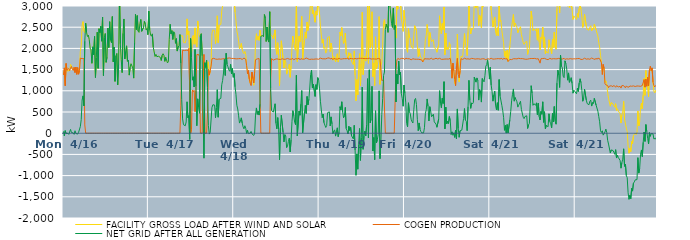
| Category | FACILITY GROSS LOAD AFTER WIND AND SOLAR | COGEN PRODUCTION | NET GRID AFTER ALL GENERATION |
|---|---|---|---|
|  Mon  4/16 | 1417 | 1374 | 43 |
|  Mon  4/16 | 1478 | 1541 | -63 |
|  Mon  4/16 | 1179 | 1119 | 60 |
|  Mon  4/16 | 1636 | 1644 | -8 |
|  Mon  4/16 | 1482 | 1484 | -2 |
|  Mon  4/16 | 1458 | 1461 | -3 |
|  Mon  4/16 | 1496 | 1524 | -28 |
|  Mon  4/16 | 1467 | 1479 | -12 |
|  Mon  4/16 | 1623 | 1533 | 90 |
|  Mon  4/16 | 1590 | 1574 | 16 |
|  Mon  4/16 | 1522 | 1511 | 11 |
|  Mon  4/16 | 1487 | 1480 | 7 |
|  Mon  4/16 | 1528 | 1555 | -27 |
|  Mon  4/16 | 1488 | 1430 | 58 |
|  Mon  4/16 | 1553 | 1560 | -7 |
|  Mon  4/16 | 1400 | 1387 | 13 |
|  Mon  4/16 | 1527 | 1548 | -21 |
|  Mon  4/16 | 1409 | 1391 | 18 |
|  Mon  4/16 | 1481 | 1472 | 9 |
|  Mon  4/16 | 1926 | 1770 | 156 |
|  Mon  4/16 | 2071 | 1752 | 319 |
|  Mon  4/16 | 2542 | 1759 | 783 |
|  Mon  4/16 | 2632 | 1752 | 880 |
|  Mon  4/16 | 2407 | 1762 | 645 |
|  Mon  4/16 | 2365 | 195 | 2170 |
|  Mon  4/16 | 2596 | 0 | 2596 |
|  Mon  4/16 | 2373 | 0 | 2373 |
|  Mon  4/16 | 2281 | 0 | 2281 |
|  Mon  4/16 | 2313 | 0 | 2313 |
|  Mon  4/16 | 2209 | 0 | 2209 |
|  Mon  4/16 | 2005 | 0 | 2005 |
|  Mon  4/16 | 1966 | 0 | 1966 |
|  Mon  4/16 | 1649 | 0 | 1649 |
|  Mon  4/16 | 2037 | 0 | 2037 |
|  Mon  4/16 | 1851 | 0 | 1851 |
|  Mon  4/16 | 2282 | 0 | 2282 |
|  Mon  4/16 | 1314 | 0 | 1314 |
|  Mon  4/16 | 1778 | 0 | 1778 |
|  Mon  4/16 | 2382 | 0 | 2382 |
|  Mon  4/16 | 1529 | 0 | 1529 |
|  Mon  4/16 | 2464 | 0 | 2464 |
|  Mon  4/16 | 2372 | 0 | 2372 |
|  Mon  4/16 | 2521 | 0 | 2521 |
|  Mon  4/16 | 2170 | 0 | 2170 |
|  Mon  4/16 | 2740 | 0 | 2740 |
|  Mon  4/16 | 1359 | 0 | 1359 |
|  Mon  4/16 | 2252 | 0 | 2252 |
|  Mon  4/16 | 2350 | 0 | 2350 |
|  Mon  4/16 | 1672 | 0 | 1672 |
|  Mon  4/16 | 1791 | 0 | 1791 |
|  Mon  4/16 | 2481 | 0 | 2481 |
|  Mon  4/16 | 2020 | 0 | 2020 |
|  Mon  4/16 | 2630 | 0 | 2630 |
|  Mon  4/16 | 2192 | 0 | 2192 |
|  Mon  4/16 | 2135 | 0 | 2135 |
|  Mon  4/16 | 2751 | 0 | 2751 |
|  Mon  4/16 | 1683 | 0 | 1683 |
|  Mon  4/16 | 2033 | 0 | 2033 |
|  Mon  4/16 | 1223 | 0 | 1223 |
|  Mon  4/16 | 1823 | 0 | 1823 |
|  Mon  4/16 | 1880 | 0 | 1880 |
|  Mon  4/16 | 1140 | 0 | 1140 |
|  Mon  4/16 | 1627 | 0 | 1627 |
|  Mon  4/16 | 3391 | 0 | 3391 |
|  Mon  4/16 | 2108 | 0 | 2108 |
|  Mon  4/16 | 1739 | 0 | 1739 |
|  Mon  4/16 | 1429 | 0 | 1429 |
|  Mon  4/16 | 2355 | 0 | 2355 |
|  Mon  4/16 | 2694 | 0 | 2694 |
|  Mon  4/16 | 1751 | 0 | 1751 |
|  Mon  4/16 | 1930 | 0 | 1930 |
|  Mon  4/16 | 2061 | 0 | 2061 |
|  Mon  4/16 | 1694 | 0 | 1694 |
|  Mon  4/16 | 1724 | 0 | 1724 |
|  Mon  4/16 | 1370 | 0 | 1370 |
|  Mon  4/16 | 1555 | 0 | 1555 |
|  Mon  4/16 | 1638 | 0 | 1638 |
|  Mon  4/16 | 1657 | 0 | 1657 |
|  Mon  4/16 | 1538 | 0 | 1538 |
|  Mon  4/16 | 1299 | 0 | 1299 |
|  Mon  4/16 | 2142 | 0 | 2142 |
|  Mon  4/16 | 2803 | 0 | 2803 |
|  Mon  4/16 | 2444 | 0 | 2444 |
|  Mon  4/16 | 2774 | 0 | 2774 |
|  Mon  4/16 | 2408 | 0 | 2408 |
|  Mon  4/16 | 2378 | 0 | 2378 |
|  Mon  4/16 | 2586 | 0 | 2586 |
|  Mon  4/16 | 2683 | 0 | 2683 |
|  Mon  4/16 | 2403 | 0 | 2403 |
|  Mon  4/16 | 2380 | 0 | 2380 |
|  Mon  4/16 | 2491 | 0 | 2491 |
|  Mon  4/16 | 2637 | 0 | 2637 |
|  Mon  4/16 | 2580 | 0 | 2580 |
|  Mon  4/16 | 2435 | 0 | 2435 |
|  Mon  4/16 | 2469 | 0 | 2469 |
|  Mon  4/16 | 2324 | 0 | 2324 |
|  Tue  4/17 | 2879 | 0 | 2879 |
|  Tue  4/17 | 2438 | 0 | 2438 |
|  Tue  4/17 | 2318 | 0 | 2318 |
|  Tue  4/17 | 2287 | 0 | 2287 |
|  Tue  4/17 | 2342 | 0 | 2342 |
|  Tue  4/17 | 2029 | 0 | 2029 |
|  Tue  4/17 | 2028 | 0 | 2028 |
|  Tue  4/17 | 1810 | 0 | 1810 |
|  Tue  4/17 | 1859 | 0 | 1859 |
|  Tue  4/17 | 1806 | 0 | 1806 |
|  Tue  4/17 | 1822 | 0 | 1822 |
|  Tue  4/17 | 1814 | 0 | 1814 |
|  Tue  4/17 | 1800 | 0 | 1800 |
|  Tue  4/17 | 1786 | 0 | 1786 |
|  Tue  4/17 | 1716 | 0 | 1716 |
|  Tue  4/17 | 1835 | 0 | 1835 |
|  Tue  4/17 | 1874 | 0 | 1874 |
|  Tue  4/17 | 1837 | 0 | 1837 |
|  Tue  4/17 | 1695 | 0 | 1695 |
|  Tue  4/17 | 1789 | 0 | 1789 |
|  Tue  4/17 | 1801 | 0 | 1801 |
|  Tue  4/17 | 1658 | 0 | 1658 |
|  Tue  4/17 | 1688 | 0 | 1688 |
|  Tue  4/17 | 2216 | 0 | 2216 |
|  Tue  4/17 | 2568 | 0 | 2568 |
|  Tue  4/17 | 2344 | 0 | 2344 |
|  Tue  4/17 | 2418 | 0 | 2418 |
|  Tue  4/17 | 2212 | 0 | 2212 |
|  Tue  4/17 | 2392 | 0 | 2392 |
|  Tue  4/17 | 2366 | 0 | 2366 |
|  Tue  4/17 | 2120 | 0 | 2120 |
|  Tue  4/17 | 2231 | 0 | 2231 |
|  Tue  4/17 | 1937 | 0 | 1937 |
|  Tue  4/17 | 2031 | 0 | 2031 |
|  Tue  4/17 | 2064 | 0 | 2064 |
|  Tue  4/17 | 2326 | 0 | 2326 |
|  Tue  4/17 | 2294 | 645 | 1649 |
|  Tue  4/17 | 2295 | 1502 | 793 |
|  Tue  4/17 | 2297 | 1960 | 337 |
|  Tue  4/17 | 2144 | 1943 | 201 |
|  Tue  4/17 | 2133 | 1948 | 185 |
|  Tue  4/17 | 2130 | 1955 | 175 |
|  Tue  4/17 | 2223 | 1958 | 265 |
|  Tue  4/17 | 2696 | 1955 | 741 |
|  Tue  4/17 | 2317 | 1952 | 365 |
|  Tue  4/17 | 2411 | 1997 | 414 |
|  Tue  4/17 | 1862 | 2008 | -146 |
|  Tue  4/17 | 2232 | 0 | 2232 |
|  Tue  4/17 | 1873 | 88 | 1785 |
|  Tue  4/17 | 2271 | 1020 | 1251 |
|  Tue  4/17 | 2310 | 980 | 1330 |
|  Tue  4/17 | 2098 | 1009 | 1089 |
|  Tue  4/17 | 2484 | 509 | 1975 |
|  Tue  4/17 | 2107 | 996 | 1111 |
|  Tue  4/17 | 2030 | 1854 | 176 |
|  Tue  4/17 | 2647 | 1837 | 810 |
|  Tue  4/17 | 2462 | 1856 | 606 |
|  Tue  4/17 | 2275 | 1804 | 471 |
|  Tue  4/17 | 2304 | 0 | 2304 |
|  Tue  4/17 | 2346 | 0 | 2346 |
|  Tue  4/17 | 1825 | 0 | 1825 |
|  Tue  4/17 | 1830 | 1257 | 573 |
|  Tue  4/17 | 1268 | 1857 | -589 |
|  Tue  4/17 | 1662 | 0 | 1662 |
|  Tue  4/17 | 1553 | 0 | 1553 |
|  Tue  4/17 | 1719 | 0 | 1719 |
|  Tue  4/17 | 1538 | 453 | 1085 |
|  Tue  4/17 | 1682 | 1505 | 177 |
|  Tue  4/17 | 1351 | 1372 | -21 |
|  Tue  4/17 | 1487 | 1475 | 12 |
|  Tue  4/17 | 1608 | 1580 | 28 |
|  Tue  4/17 | 2358 | 1754 | 604 |
|  Tue  4/17 | 2434 | 1763 | 671 |
|  Tue  4/17 | 2437 | 1766 | 671 |
|  Tue  4/17 | 2423 | 1759 | 664 |
|  Tue  4/17 | 2112 | 1748 | 364 |
|  Tue  4/17 | 2350 | 1749 | 601 |
|  Tue  4/17 | 2769 | 1743 | 1026 |
|  Tue  4/17 | 2131 | 1754 | 377 |
|  Tue  4/17 | 2548 | 1750 | 798 |
|  Tue  4/17 | 2567 | 1760 | 807 |
|  Tue  4/17 | 2567 | 1745 | 822 |
|  Tue  4/17 | 2887 | 1746 | 1141 |
|  Tue  4/17 | 2998 | 1754 | 1244 |
|  Tue  4/17 | 3164 | 1744 | 1420 |
|  Tue  4/17 | 3496 | 1757 | 1739 |
|  Tue  4/17 | 3122 | 1759 | 1363 |
|  Tue  4/17 | 3645 | 1760 | 1885 |
|  Tue  4/17 | 3370 | 1746 | 1624 |
|  Tue  4/17 | 3336 | 1770 | 1566 |
|  Tue  4/17 | 3244 | 1752 | 1492 |
|  Tue  4/17 | 3234 | 1774 | 1460 |
|  Tue  4/17 | 3378 | 1753 | 1625 |
|  Tue  4/17 | 3163 | 1763 | 1400 |
|  Tue  4/17 | 3280 | 1753 | 1527 |
|  Tue  4/17 | 3082 | 1763 | 1319 |
|  Wed  4/18 | 3160 | 1752 | 1408 |
|  Wed  4/18 | 2851 | 1757 | 1094 |
|  Wed  4/18 | 2662 | 1744 | 918 |
|  Wed  4/18 | 2414 | 1753 | 661 |
|  Wed  4/18 | 2311 | 1740 | 571 |
|  Wed  4/18 | 2168 | 1758 | 410 |
|  Wed  4/18 | 1996 | 1758 | 238 |
|  Wed  4/18 | 2049 | 1762 | 287 |
|  Wed  4/18 | 2118 | 1756 | 362 |
|  Wed  4/18 | 1981 | 1740 | 241 |
|  Wed  4/18 | 1907 | 1757 | 150 |
|  Wed  4/18 | 1875 | 1772 | 103 |
|  Wed  4/18 | 1931 | 1755 | 176 |
|  Wed  4/18 | 1859 | 1745 | 114 |
|  Wed  4/18 | 1587 | 1591 | -4 |
|  Wed  4/18 | 1472 | 1401 | 71 |
|  Wed  4/18 | 1468 | 1478 | -10 |
|  Wed  4/18 | 1254 | 1279 | -25 |
|  Wed  4/18 | 1183 | 1181 | 2 |
|  Wed  4/18 | 1168 | 1126 | 42 |
|  Wed  4/18 | 1426 | 1441 | -15 |
|  Wed  4/18 | 1266 | 1288 | -22 |
|  Wed  4/18 | 1131 | 1184 | -53 |
|  Wed  4/18 | 1453 | 1453 | 0 |
|  Wed  4/18 | 2159 | 1732 | 427 |
|  Wed  4/18 | 2346 | 1750 | 596 |
|  Wed  4/18 | 2197 | 1753 | 444 |
|  Wed  4/18 | 2283 | 1763 | 520 |
|  Wed  4/18 | 2189 | 1761 | 428 |
|  Wed  4/18 | 2429 | 1746 | 683 |
|  Wed  4/18 | 2286 | 0 | 2286 |
|  Wed  4/18 | 2289 | 0 | 2289 |
|  Wed  4/18 | 2302 | 0 | 2302 |
|  Wed  4/18 | 2276 | 0 | 2276 |
|  Wed  4/18 | 2799 | 0 | 2799 |
|  Wed  4/18 | 2717 | 0 | 2717 |
|  Wed  4/18 | 2163 | 0 | 2163 |
|  Wed  4/18 | 2505 | 0 | 2505 |
|  Wed  4/18 | 2204 | 0 | 2204 |
|  Wed  4/18 | 2149 | 0 | 2149 |
|  Wed  4/18 | 2865 | 0 | 2865 |
|  Wed  4/18 | 2309 | 1247 | 1062 |
|  Wed  4/18 | 2297 | 1761 | 536 |
|  Wed  4/18 | 2290 | 1751 | 539 |
|  Wed  4/18 | 2222 | 1724 | 498 |
|  Wed  4/18 | 2236 | 1745 | 491 |
|  Wed  4/18 | 2437 | 1743 | 694 |
|  Wed  4/18 | 1991 | 1758 | 233 |
|  Wed  4/18 | 1857 | 1754 | 103 |
|  Wed  4/18 | 2134 | 1767 | 367 |
|  Wed  4/18 | 1832 | 1743 | 89 |
|  Wed  4/18 | 1119 | 1748 | -629 |
|  Wed  4/18 | 1876 | 1738 | 138 |
|  Wed  4/18 | 2180 | 1757 | 423 |
|  Wed  4/18 | 2195 | 1756 | 439 |
|  Wed  4/18 | 1767 | 1746 | 21 |
|  Wed  4/18 | 1538 | 1743 | -205 |
|  Wed  4/18 | 1722 | 1755 | -33 |
|  Wed  4/18 | 1681 | 1746 | -65 |
|  Wed  4/18 | 1393 | 1736 | -343 |
|  Wed  4/18 | 1462 | 1763 | -301 |
|  Wed  4/18 | 1551 | 1743 | -192 |
|  Wed  4/18 | 1627 | 1746 | -119 |
|  Wed  4/18 | 1318 | 1761 | -443 |
|  Wed  4/18 | 1593 | 1745 | -152 |
|  Wed  4/18 | 2016 | 1745 | 271 |
|  Wed  4/18 | 2292 | 1761 | 531 |
|  Wed  4/18 | 2146 | 1733 | 413 |
|  Wed  4/18 | 2013 | 1752 | 261 |
|  Wed  4/18 | 1958 | 1757 | 201 |
|  Wed  4/18 | 3110 | 1744 | 1366 |
|  Wed  4/18 | 1688 | 1752 | -64 |
|  Wed  4/18 | 1684 | 1742 | -58 |
|  Wed  4/18 | 2289 | 1767 | 522 |
|  Wed  4/18 | 2155 | 1731 | 424 |
|  Wed  4/18 | 2444 | 1758 | 686 |
|  Wed  4/18 | 2758 | 1753 | 1005 |
|  Wed  4/18 | 1754 | 1745 | 9 |
|  Wed  4/18 | 1736 | 1746 | -10 |
|  Wed  4/18 | 2218 | 1749 | 469 |
|  Wed  4/18 | 2388 | 1733 | 655 |
|  Wed  4/18 | 2239 | 1774 | 465 |
|  Wed  4/18 | 2623 | 1756 | 867 |
|  Wed  4/18 | 2422 | 1753 | 669 |
|  Wed  4/18 | 2564 | 1762 | 802 |
|  Wed  4/18 | 2806 | 1740 | 1066 |
|  Wed  4/18 | 3134 | 1750 | 1384 |
|  Wed  4/18 | 3233 | 1747 | 1486 |
|  Wed  4/18 | 2813 | 1748 | 1065 |
|  Wed  4/18 | 2902 | 1743 | 1159 |
|  Wed  4/18 | 2898 | 1758 | 1140 |
|  Wed  4/18 | 2617 | 1749 | 868 |
|  Wed  4/18 | 2881 | 1736 | 1145 |
|  Wed  4/18 | 2785 | 1751 | 1034 |
|  Wed  4/18 | 3069 | 1759 | 1310 |
|  Wed  4/18 | 2992 | 1744 | 1248 |
|  Thu  4/19 | 2807 | 1760 | 1047 |
|  Thu  4/19 | 2525 | 1771 | 754 |
|  Thu  4/19 | 2313 | 1764 | 549 |
|  Thu  4/19 | 2123 | 1755 | 368 |
|  Thu  4/19 | 2214 | 1764 | 450 |
|  Thu  4/19 | 2001 | 1754 | 247 |
|  Thu  4/19 | 2025 | 1759 | 266 |
|  Thu  4/19 | 1888 | 1753 | 135 |
|  Thu  4/19 | 1929 | 1751 | 178 |
|  Thu  4/19 | 2253 | 1771 | 482 |
|  Thu  4/19 | 2248 | 1769 | 479 |
|  Thu  4/19 | 2281 | 1777 | 504 |
|  Thu  4/19 | 1922 | 1752 | 170 |
|  Thu  4/19 | 2125 | 1740 | 385 |
|  Thu  4/19 | 1986 | 1767 | 219 |
|  Thu  4/19 | 1723 | 1734 | -11 |
|  Thu  4/19 | 1808 | 1763 | 45 |
|  Thu  4/19 | 1825 | 1746 | 79 |
|  Thu  4/19 | 1683 | 1751 | -68 |
|  Thu  4/19 | 1809 | 1762 | 47 |
|  Thu  4/19 | 1873 | 1746 | 127 |
|  Thu  4/19 | 1678 | 1759 | -81 |
|  Thu  4/19 | 1783 | 1765 | 18 |
|  Thu  4/19 | 2386 | 1761 | 625 |
|  Thu  4/19 | 2294 | 1746 | 548 |
|  Thu  4/19 | 2491 | 1750 | 741 |
|  Thu  4/19 | 2257 | 1754 | 503 |
|  Thu  4/19 | 2117 | 1751 | 366 |
|  Thu  4/19 | 2179 | 1759 | 420 |
|  Thu  4/19 | 2362 | 1754 | 608 |
|  Thu  4/19 | 1865 | 1756 | 109 |
|  Thu  4/19 | 1824 | 1767 | 57 |
|  Thu  4/19 | 1755 | 1774 | -19 |
|  Thu  4/19 | 1898 | 1737 | 161 |
|  Thu  4/19 | 1827 | 1763 | 64 |
|  Thu  4/19 | 1879 | 1741 | 138 |
|  Thu  4/19 | 1698 | 1761 | -63 |
|  Thu  4/19 | 1712 | 1756 | -44 |
|  Thu  4/19 | 1617 | 1751 | -134 |
|  Thu  4/19 | 1942 | 1756 | 186 |
|  Thu  4/19 | 1366 | 1763 | -397 |
|  Thu  4/19 | 762 | 1755 | -993 |
|  Thu  4/19 | 1264 | 1752 | -488 |
|  Thu  4/19 | 901 | 1750 | -849 |
|  Thu  4/19 | 1499 | 1765 | -266 |
|  Thu  4/19 | 1876 | 1765 | 111 |
|  Thu  4/19 | 1124 | 1765 | -641 |
|  Thu  4/19 | 1641 | 1750 | -109 |
|  Thu  4/19 | 2853 | 1766 | 1087 |
|  Thu  4/19 | 1382 | 1761 | -379 |
|  Thu  4/19 | 1692 | 1760 | -68 |
|  Thu  4/19 | 1810 | 1762 | 48 |
|  Thu  4/19 | 1700 | 1760 | -60 |
|  Thu  4/19 | 1944 | 1741 | 203 |
|  Thu  4/19 | 3045 | 1759 | 1286 |
|  Thu  4/19 | 1645 | 1756 | -111 |
|  Thu  4/19 | 3264 | 1769 | 1495 |
|  Thu  4/19 | 2007 | 1762 | 245 |
|  Thu  4/19 | 2092 | 1749 | 343 |
|  Thu  4/19 | 2864 | 1759 | 1105 |
|  Thu  4/19 | 1334 | 1753 | -419 |
|  Thu  4/19 | 1658 | 1760 | -102 |
|  Thu  4/19 | 1126 | 1750 | -624 |
|  Thu  4/19 | 2272 | 1743 | 529 |
|  Thu  4/19 | 1517 | 1748 | -231 |
|  Thu  4/19 | 1616 | 1765 | -149 |
|  Thu  4/19 | 1738 | 1764 | -26 |
|  Thu  4/19 | 2750 | 1751 | 999 |
|  Thu  4/19 | 1151 | 1751 | -600 |
|  Thu  4/19 | 1575 | 1761 | -186 |
|  Thu  4/19 | 1684 | 1244 | 440 |
|  Thu  4/19 | 2082 | 1262 | 820 |
|  Thu  4/19 | 2616 | 1256 | 1360 |
|  Thu  4/19 | 2682 | 1239 | 1443 |
|  Thu  4/19 | 2444 | 0 | 2444 |
|  Thu  4/19 | 2570 | 0 | 2570 |
|  Thu  4/19 | 2507 | 0 | 2507 |
|  Thu  4/19 | 2378 | 0 | 2378 |
|  Thu  4/19 | 3356 | 0 | 3356 |
|  Thu  4/19 | 3047 | 0 | 3047 |
|  Thu  4/19 | 3059 | 0 | 3059 |
|  Thu  4/19 | 2583 | 0 | 2583 |
|  Thu  4/19 | 2497 | 0 | 2497 |
|  Thu  4/19 | 2946 | 0 | 2946 |
|  Thu  4/19 | 2448 | 0 | 2448 |
|  Thu  4/19 | 2542 | 0 | 2542 |
|  Thu  4/19 | 2244 | 1507 | 737 |
|  Thu  4/19 | 3124 | 1728 | 1396 |
|  Thu  4/19 | 2926 | 1762 | 1164 |
|  Thu  4/19 | 3454 | 1753 | 1701 |
|  Thu  4/19 | 3124 | 1744 | 1380 |
|  Thu  4/19 | 3185 | 1749 | 1436 |
|  Thu  4/19 | 2698 | 1763 | 935 |
|  Thu  4/19 | 2580 | 1761 | 819 |
|  Thu  4/19 | 2401 | 1765 | 636 |
|  Thu  4/19 | 2899 | 1763 | 1136 |
|  Fri  4/20 | 2680 | 1739 | 941 |
|  Fri  4/20 | 2483 | 1769 | 714 |
|  Fri  4/20 | 1974 | 1748 | 226 |
|  Fri  4/20 | 1909 | 1757 | 152 |
|  Fri  4/20 | 2466 | 1749 | 717 |
|  Fri  4/20 | 2263 | 1756 | 507 |
|  Fri  4/20 | 2235 | 1772 | 463 |
|  Fri  4/20 | 2060 | 1731 | 329 |
|  Fri  4/20 | 2024 | 1753 | 271 |
|  Fri  4/20 | 1996 | 1756 | 240 |
|  Fri  4/20 | 2304 | 1751 | 553 |
|  Fri  4/20 | 2535 | 1746 | 789 |
|  Fri  4/20 | 2556 | 1736 | 820 |
|  Fri  4/20 | 2421 | 1744 | 677 |
|  Fri  4/20 | 2071 | 1743 | 328 |
|  Fri  4/20 | 1805 | 1746 | 59 |
|  Fri  4/20 | 1993 | 1751 | 242 |
|  Fri  4/20 | 1826 | 1737 | 89 |
|  Fri  4/20 | 1794 | 1756 | 38 |
|  Fri  4/20 | 1736 | 1728 | 8 |
|  Fri  4/20 | 1680 | 1680 | 0 |
|  Fri  4/20 | 1720 | 1712 | 8 |
|  Fri  4/20 | 1887 | 1758 | 129 |
|  Fri  4/20 | 2210 | 1751 | 459 |
|  Fri  4/20 | 2309 | 1753 | 556 |
|  Fri  4/20 | 2563 | 1755 | 808 |
|  Fri  4/20 | 2384 | 1752 | 632 |
|  Fri  4/20 | 2042 | 1754 | 288 |
|  Fri  4/20 | 2374 | 1749 | 625 |
|  Fri  4/20 | 2255 | 1742 | 513 |
|  Fri  4/20 | 2158 | 1771 | 387 |
|  Fri  4/20 | 2146 | 1742 | 404 |
|  Fri  4/20 | 2207 | 1759 | 448 |
|  Fri  4/20 | 2017 | 1750 | 267 |
|  Fri  4/20 | 2010 | 1744 | 266 |
|  Fri  4/20 | 1983 | 1767 | 216 |
|  Fri  4/20 | 1909 | 1769 | 140 |
|  Fri  4/20 | 1906 | 1750 | 156 |
|  Fri  4/20 | 2090 | 1754 | 336 |
|  Fri  4/20 | 2769 | 1766 | 1003 |
|  Fri  4/20 | 2464 | 1758 | 706 |
|  Fri  4/20 | 2344 | 1743 | 601 |
|  Fri  4/20 | 2588 | 1764 | 824 |
|  Fri  4/20 | 2445 | 1744 | 701 |
|  Fri  4/20 | 2977 | 1762 | 1215 |
|  Fri  4/20 | 1852 | 1749 | 103 |
|  Fri  4/20 | 2362 | 1748 | 614 |
|  Fri  4/20 | 1969 | 1750 | 219 |
|  Fri  4/20 | 2020 | 1737 | 283 |
|  Fri  4/20 | 1976 | 1748 | 228 |
|  Fri  4/20 | 2138 | 1745 | 393 |
|  Fri  4/20 | 2060 | 1766 | 294 |
|  Fri  4/20 | 1582 | 1612 | -30 |
|  Fri  4/20 | 1329 | 1297 | 32 |
|  Fri  4/20 | 1602 | 1652 | -50 |
|  Fri  4/20 | 1481 | 1472 | 9 |
|  Fri  4/20 | 1167 | 1266 | -99 |
|  Fri  4/20 | 1191 | 1121 | 70 |
|  Fri  4/20 | 1451 | 1587 | -136 |
|  Fri  4/20 | 2337 | 1765 | 572 |
|  Fri  4/20 | 1496 | 1387 | 109 |
|  Fri  4/20 | 1211 | 1307 | -96 |
|  Fri  4/20 | 1522 | 1465 | 57 |
|  Fri  4/20 | 1811 | 1758 | 53 |
|  Fri  4/20 | 1834 | 1762 | 72 |
|  Fri  4/20 | 1802 | 1739 | 63 |
|  Fri  4/20 | 2103 | 1753 | 350 |
|  Fri  4/20 | 2349 | 1768 | 581 |
|  Fri  4/20 | 2073 | 1761 | 312 |
|  Fri  4/20 | 2031 | 1750 | 281 |
|  Fri  4/20 | 1832 | 1772 | 60 |
|  Fri  4/20 | 2379 | 1754 | 625 |
|  Fri  4/20 | 3017 | 1771 | 1246 |
|  Fri  4/20 | 2521 | 1745 | 776 |
|  Fri  4/20 | 2340 | 1754 | 586 |
|  Fri  4/20 | 2480 | 1765 | 715 |
|  Fri  4/20 | 2449 | 1758 | 691 |
|  Fri  4/20 | 2485 | 1759 | 726 |
|  Fri  4/20 | 3082 | 1759 | 1323 |
|  Fri  4/20 | 3063 | 1748 | 1315 |
|  Fri  4/20 | 2951 | 1747 | 1204 |
|  Fri  4/20 | 3058 | 1754 | 1304 |
|  Fri  4/20 | 2982 | 1742 | 1240 |
|  Fri  4/20 | 2535 | 1754 | 781 |
|  Fri  4/20 | 2786 | 1758 | 1028 |
|  Fri  4/20 | 2717 | 1745 | 972 |
|  Fri  4/20 | 2490 | 1756 | 734 |
|  Fri  4/20 | 3046 | 1755 | 1291 |
|  Fri  4/20 | 2986 | 1734 | 1252 |
|  Fri  4/20 | 2966 | 1755 | 1211 |
|  Fri  4/20 | 3112 | 1757 | 1355 |
|  Fri  4/20 | 3314 | 1733 | 1581 |
|  Fri  4/20 | 3355 | 1739 | 1616 |
|  Fri  4/20 | 3488 | 1757 | 1731 |
|  Fri  4/20 | 3292 | 1752 | 1540 |
|  Fri  4/20 | 3023 | 1747 | 1276 |
|  Sat  4/21 | 3320 | 1766 | 1554 |
|  Sat  4/21 | 2903 | 1767 | 1136 |
|  Sat  4/21 | 2730 | 1748 | 982 |
|  Sat  4/21 | 2503 | 1747 | 756 |
|  Sat  4/21 | 2653 | 1753 | 900 |
|  Sat  4/21 | 2742 | 1750 | 992 |
|  Sat  4/21 | 2394 | 1742 | 652 |
|  Sat  4/21 | 2305 | 1755 | 550 |
|  Sat  4/21 | 2488 | 1769 | 719 |
|  Sat  4/21 | 2301 | 1759 | 542 |
|  Sat  4/21 | 3020 | 1755 | 1265 |
|  Sat  4/21 | 2634 | 1753 | 881 |
|  Sat  4/21 | 2660 | 1758 | 902 |
|  Sat  4/21 | 2424 | 1766 | 658 |
|  Sat  4/21 | 2273 | 1737 | 536 |
|  Sat  4/21 | 2136 | 1763 | 373 |
|  Sat  4/21 | 1812 | 1744 | 68 |
|  Sat  4/21 | 1938 | 1754 | 184 |
|  Sat  4/21 | 1753 | 1750 | 3 |
|  Sat  4/21 | 1958 | 1754 | 204 |
|  Sat  4/21 | 1696 | 1691 | 5 |
|  Sat  4/21 | 1680 | 1683 | -3 |
|  Sat  4/21 | 2058 | 1741 | 317 |
|  Sat  4/21 | 2275 | 1762 | 513 |
|  Sat  4/21 | 2499 | 1736 | 763 |
|  Sat  4/21 | 2663 | 1744 | 919 |
|  Sat  4/21 | 2800 | 1756 | 1044 |
|  Sat  4/21 | 2515 | 1759 | 756 |
|  Sat  4/21 | 2597 | 1756 | 841 |
|  Sat  4/21 | 2551 | 1763 | 788 |
|  Sat  4/21 | 2494 | 1753 | 741 |
|  Sat  4/21 | 2370 | 1755 | 615 |
|  Sat  4/21 | 2428 | 1767 | 661 |
|  Sat  4/21 | 2427 | 1755 | 672 |
|  Sat  4/21 | 2511 | 1758 | 753 |
|  Sat  4/21 | 2324 | 1764 | 560 |
|  Sat  4/21 | 2323 | 1759 | 564 |
|  Sat  4/21 | 2142 | 1764 | 378 |
|  Sat  4/21 | 2095 | 1751 | 344 |
|  Sat  4/21 | 2140 | 1747 | 393 |
|  Sat  4/21 | 2117 | 1744 | 373 |
|  Sat  4/21 | 2164 | 1753 | 411 |
|  Sat  4/21 | 1858 | 1747 | 111 |
|  Sat  4/21 | 1955 | 1761 | 194 |
|  Sat  4/21 | 1990 | 1757 | 233 |
|  Sat  4/21 | 2464 | 1770 | 694 |
|  Sat  4/21 | 2882 | 1762 | 1120 |
|  Sat  4/21 | 2696 | 1751 | 945 |
|  Sat  4/21 | 2418 | 1761 | 657 |
|  Sat  4/21 | 2455 | 1759 | 696 |
|  Sat  4/21 | 2477 | 1764 | 713 |
|  Sat  4/21 | 2419 | 1758 | 661 |
|  Sat  4/21 | 2468 | 1752 | 716 |
|  Sat  4/21 | 2195 | 1757 | 438 |
|  Sat  4/21 | 2465 | 1757 | 708 |
|  Sat  4/21 | 2152 | 1762 | 390 |
|  Sat  4/21 | 1963 | 1652 | 311 |
|  Sat  4/21 | 2269 | 1756 | 513 |
|  Sat  4/21 | 2224 | 1777 | 447 |
|  Sat  4/21 | 2501 | 1761 | 740 |
|  Sat  4/21 | 2023 | 1767 | 256 |
|  Sat  4/21 | 2271 | 1765 | 506 |
|  Sat  4/21 | 1874 | 1769 | 105 |
|  Sat  4/21 | 1930 | 1745 | 185 |
|  Sat  4/21 | 1935 | 1741 | 194 |
|  Sat  4/21 | 1887 | 1734 | 153 |
|  Sat  4/21 | 2204 | 1746 | 458 |
|  Sat  4/21 | 2037 | 1765 | 272 |
|  Sat  4/21 | 1970 | 1748 | 222 |
|  Sat  4/21 | 1874 | 1749 | 125 |
|  Sat  4/21 | 2210 | 1744 | 466 |
|  Sat  4/21 | 2023 | 1758 | 265 |
|  Sat  4/21 | 2382 | 1753 | 629 |
|  Sat  4/21 | 2032 | 1754 | 278 |
|  Sat  4/21 | 1980 | 1768 | 212 |
|  Sat  4/21 | 2936 | 1754 | 1182 |
|  Sat  4/21 | 3226 | 1739 | 1487 |
|  Sat  4/21 | 3140 | 1765 | 1375 |
|  Sat  4/21 | 2835 | 1756 | 1079 |
|  Sat  4/21 | 3592 | 1750 | 1842 |
|  Sat  4/21 | 3340 | 1755 | 1585 |
|  Sat  4/21 | 3289 | 1748 | 1541 |
|  Sat  4/21 | 3106 | 1762 | 1344 |
|  Sat  4/21 | 3079 | 1768 | 1311 |
|  Sat  4/21 | 3448 | 1741 | 1707 |
|  Sat  4/21 | 3391 | 1749 | 1642 |
|  Sat  4/21 | 3269 | 1755 | 1514 |
|  Sat  4/21 | 2996 | 1745 | 1251 |
|  Sat  4/21 | 3170 | 1748 | 1422 |
|  Sat  4/21 | 2960 | 1762 | 1198 |
|  Sat  4/21 | 2994 | 1759 | 1235 |
|  Sat  4/21 | 3061 | 1752 | 1309 |
|  Sat  4/21 | 2923 | 1749 | 1174 |
|  Sat  4/21 | 2682 | 1738 | 944 |
|  Sat  4/21 | 2766 | 1755 | 1011 |
|  Sat  4/21 | 2732 | 1748 | 984 |
|  Sat  4/21 | 2741 | 1753 | 988 |
|  Sun  4/22 | 2685 | 1755 | 930 |
|  Sun  4/22 | 2826 | 1760 | 1066 |
|  Sun  4/22 | 2731 | 1748 | 983 |
|  Sun  4/22 | 2946 | 1763 | 1183 |
|  Sun  4/22 | 3038 | 1754 | 1284 |
|  Sun  4/22 | 2931 | 1740 | 1191 |
|  Sun  4/22 | 2740 | 1734 | 1006 |
|  Sun  4/22 | 2495 | 1741 | 754 |
|  Sun  4/22 | 2584 | 1759 | 825 |
|  Sun  4/22 | 2807 | 1769 | 1038 |
|  Sun  4/22 | 2792 | 1757 | 1035 |
|  Sun  4/22 | 2526 | 1746 | 780 |
|  Sun  4/22 | 2446 | 1748 | 698 |
|  Sun  4/22 | 2452 | 1754 | 698 |
|  Sun  4/22 | 2431 | 1760 | 671 |
|  Sun  4/22 | 2499 | 1744 | 755 |
|  Sun  4/22 | 2536 | 1757 | 779 |
|  Sun  4/22 | 2413 | 1773 | 640 |
|  Sun  4/22 | 2476 | 1753 | 723 |
|  Sun  4/22 | 2452 | 1753 | 699 |
|  Sun  4/22 | 2570 | 1748 | 822 |
|  Sun  4/22 | 2550 | 1740 | 810 |
|  Sun  4/22 | 2433 | 1770 | 663 |
|  Sun  4/22 | 2410 | 1742 | 668 |
|  Sun  4/22 | 2289 | 1770 | 519 |
|  Sun  4/22 | 2141 | 1747 | 394 |
|  Sun  4/22 | 2026 | 1757 | 269 |
|  Sun  4/22 | 1830 | 1774 | 56 |
|  Sun  4/22 | 1678 | 1661 | 17 |
|  Sun  4/22 | 1442 | 1385 | 57 |
|  Sun  4/22 | 1576 | 1622 | -46 |
|  Sun  4/22 | 1514 | 1528 | -14 |
|  Sun  4/22 | 1195 | 1165 | 30 |
|  Sun  4/22 | 1237 | 1140 | 97 |
|  Sun  4/22 | 1169 | 1154 | 15 |
|  Sun  4/22 | 957 | 1125 | -168 |
|  Sun  4/22 | 817 | 1073 | -256 |
|  Sun  4/22 | 840 | 1112 | -272 |
|  Sun  4/22 | 637 | 1105 | -468 |
|  Sun  4/22 | 723 | 1118 | -395 |
|  Sun  4/22 | 714 | 1125 | -411 |
|  Sun  4/22 | 690 | 1098 | -408 |
|  Sun  4/22 | 680 | 1129 | -449 |
|  Sun  4/22 | 614 | 1112 | -498 |
|  Sun  4/22 | 696 | 1084 | -388 |
|  Sun  4/22 | 534 | 1120 | -586 |
|  Sun  4/22 | 578 | 1097 | -519 |
|  Sun  4/22 | 520 | 1092 | -572 |
|  Sun  4/22 | 511 | 1086 | -575 |
|  Sun  4/22 | 461 | 1105 | -644 |
|  Sun  4/22 | 239 | 1064 | -825 |
|  Sun  4/22 | 431 | 1123 | -692 |
|  Sun  4/22 | 498 | 1111 | -613 |
|  Sun  4/22 | 753 | 1121 | -368 |
|  Sun  4/22 | 333 | 1114 | -781 |
|  Sun  4/22 | 343 | 1070 | -727 |
|  Sun  4/22 | 118 | 1116 | -998 |
|  Sun  4/22 | 41 | 1092 | -1051 |
|  Sun  4/22 | -305 | 1099 | -1404 |
|  Sun  4/22 | -472 | 1087 | -1559 |
|  Sun  4/22 | -349 | 1114 | -1463 |
|  Sun  4/22 | -433 | 1111 | -1544 |
|  Sun  4/22 | -194 | 1107 | -1301 |
|  Sun  4/22 | -250 | 1116 | -1366 |
|  Sun  4/22 | -62 | 1116 | -1178 |
|  Sun  4/22 | -25 | 1124 | -1149 |
|  Sun  4/22 | 1 | 1101 | -1100 |
|  Sun  4/22 | -37 | 1081 | -1118 |
|  Sun  4/22 | 19 | 1114 | -1095 |
|  Sun  4/22 | 525 | 1102 | -577 |
|  Sun  4/22 | 170 | 1111 | -941 |
|  Sun  4/22 | 267 | 1097 | -830 |
|  Sun  4/22 | 611 | 1106 | -495 |
|  Sun  4/22 | 710 | 1105 | -395 |
|  Sun  4/22 | 572 | 1124 | -552 |
|  Sun  4/22 | 902 | 1116 | -214 |
|  Sun  4/22 | 1291 | 1263 | 28 |
|  Sun  4/22 | 892 | 1086 | -194 |
|  Sun  4/22 | 1477 | 1273 | 204 |
|  Sun  4/22 | 1146 | 1108 | 38 |
|  Sun  4/22 | 1197 | 1315 | -118 |
|  Sun  4/22 | 861 | 1114 | -253 |
|  Sun  4/22 | 1504 | 1489 | 15 |
|  Sun  4/22 | 1506 | 1580 | -74 |
|  Sun  4/22 | 1468 | 1477 | -9 |
|  Sun  4/22 | 1530 | 1540 | -10 |
|  Sun  4/22 | 1191 | 1206 | -15 |
|  Sun  4/22 | 991 | 1127 | -136 |
|  Sun  4/22 | 951 | 1091 | -140 |
|  Sun  4/22 | 1011 | 1128 | -117 |
|  Sun  4/22 | 956 | 1120 | -164 |